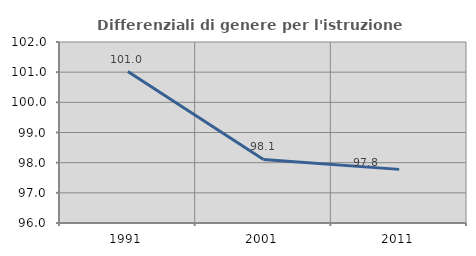
| Category | Differenziali di genere per l'istruzione superiore |
|---|---|
| 1991.0 | 101.02 |
| 2001.0 | 98.106 |
| 2011.0 | 97.778 |